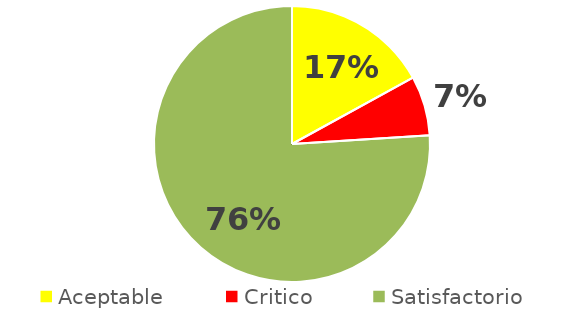
| Category | Series 0 |
|---|---|
| Aceptable | 0.17 |
| Critico | 0.07 |
| Satisfactorio | 0.76 |